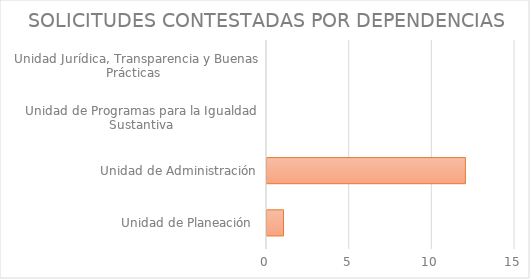
| Category | Series 1 |
|---|---|
| Unidad de Planeación  | 1 |
| Unidad de Administración | 12 |
| Unidad de Programas para la Igualdad Sustantiva | 0 |
| Unidad Jurídica, Transparencia y Buenas Prácticas  | 0 |